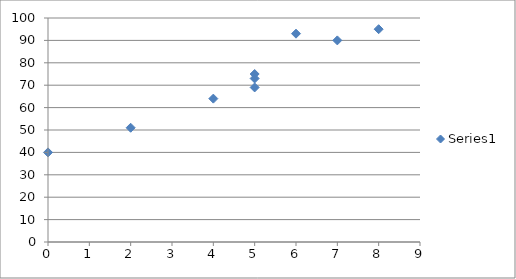
| Category | Series 0 |
|---|---|
| 0.0 | 40 |
| 2.0 | 51 |
| 4.0 | 64 |
| 5.0 | 69 |
| 5.0 | 73 |
| 5.0 | 75 |
| 6.0 | 93 |
| 7.0 | 90 |
| 8.0 | 95 |